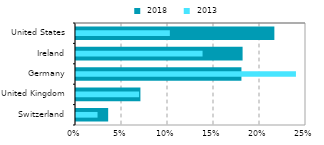
| Category |  2018 |
|---|---|
| Switzerland | 0.035 |
| United Kingdom | 0.07 |
| Germany | 0.18 |
| Ireland | 0.181 |
| United States | 0.216 |